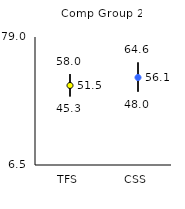
| Category | 25th | 75th | Mean |
|---|---|---|---|
| TFS | 45.3 | 58 | 51.54 |
| CSS | 48 | 64.6 | 56.06 |